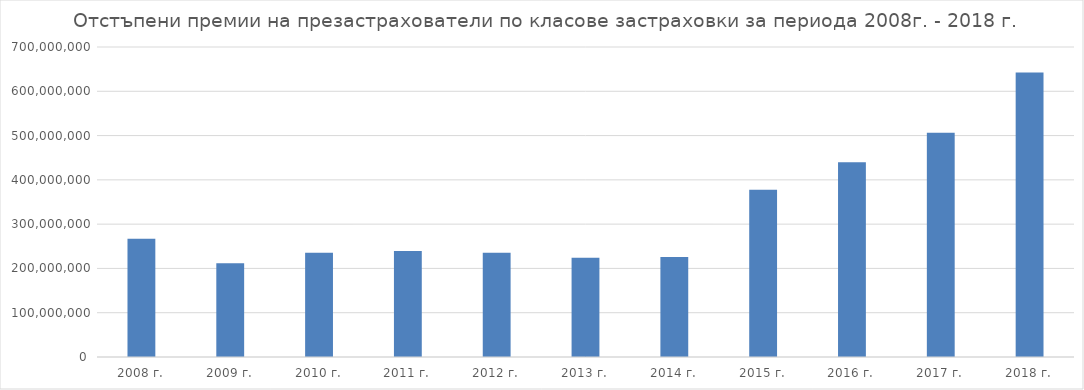
| Category | Series 0 |
|---|---|
| 2008 г. | 267014465.243 |
| 2009 г. | 211607008.844 |
| 2010 г. | 235369864.249 |
| 2011 г. | 239630505.177 |
| 2012 г. | 235585203.769 |
| 2013 г. | 224010693.226 |
| 2014 г. | 225803248.762 |
| 2015 г. | 377411422.386 |
| 2016 г. | 439683141.844 |
| 2017 г. | 506089881.084 |
| 2018 г. | 642550670.561 |